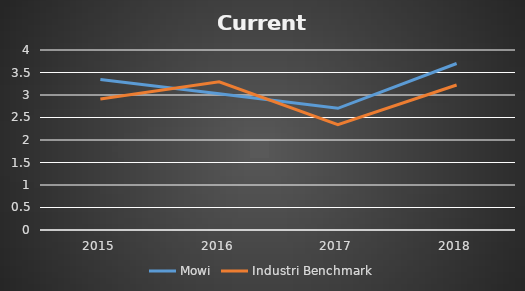
| Category | Mowi | Industri Benchmark |
|---|---|---|
| 2015.0 | 3.344 | 2.91 |
| 2016.0 | 3.026 | 3.292 |
| 2017.0 | 2.705 | 2.342 |
| 2018.0 | 3.7 | 3.222 |